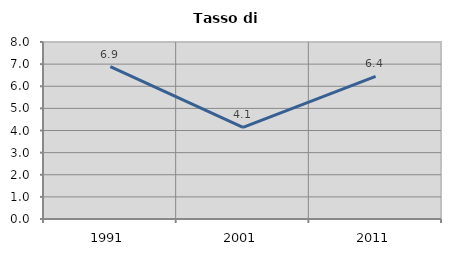
| Category | Tasso di disoccupazione   |
|---|---|
| 1991.0 | 6.888 |
| 2001.0 | 4.144 |
| 2011.0 | 6.443 |